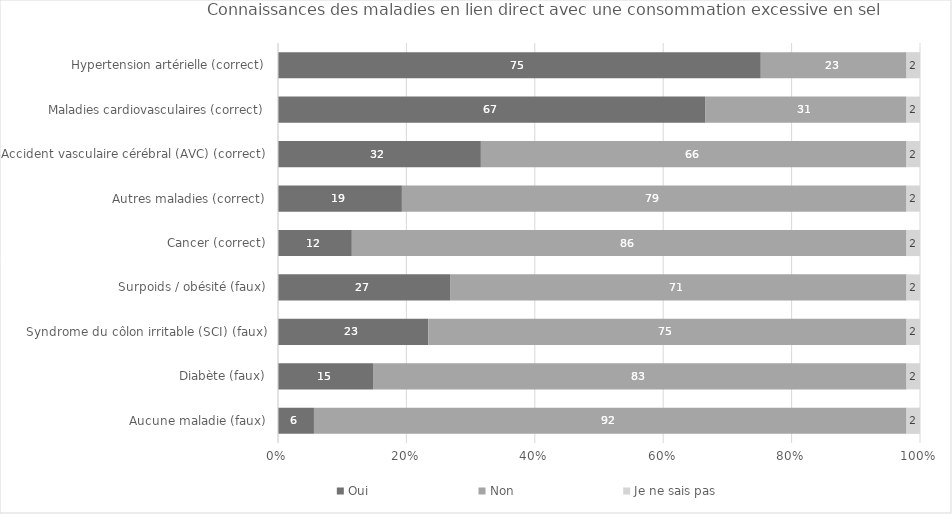
| Category | Oui | Non | Je ne sais pas  |
|---|---|---|---|
| Hypertension artérielle (correct) | 75.2 | 22.7 | 2.1 |
| Maladies cardiovasculaires (correct) | 66.6 | 31.3 | 2.1 |
| Accident vasculaire cérébral (AVC) (correct) | 31.6 | 66.3 | 2.1 |
| Autres maladies (correct) | 19.3 | 78.6 | 2.1 |
| Cancer (correct) | 11.5 | 86.4 | 2.1 |
| Surpoids / obésité (faux) | 26.8 | 71.1 | 2.1 |
| Syndrome du côlon irritable (SCI) (faux) | 23.4 | 74.5 | 2.1 |
| Diabète (faux) | 14.8 | 83.1 | 2.1 |
| Aucune maladie (faux) | 5.6 | 92.3 | 2.1 |